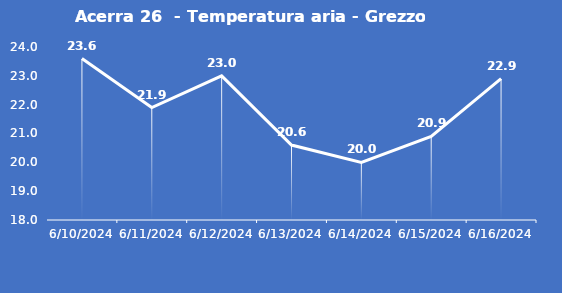
| Category | Acerra 26  - Temperatura aria - Grezzo (°C) |
|---|---|
| 6/10/24 | 23.6 |
| 6/11/24 | 21.9 |
| 6/12/24 | 23 |
| 6/13/24 | 20.6 |
| 6/14/24 | 20 |
| 6/15/24 | 20.9 |
| 6/16/24 | 22.9 |